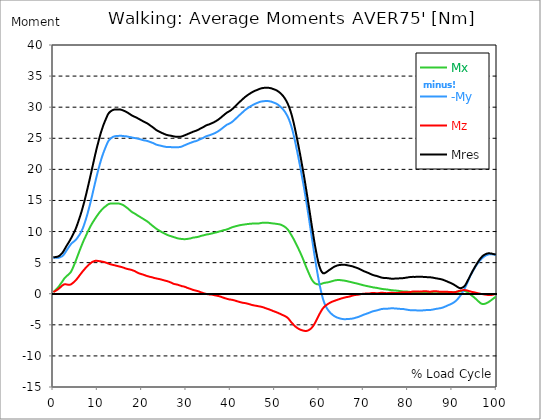
| Category |  Mx |  -My |  Mz |  Mres |
|---|---|---|---|---|
| 0.0 | 0.27 | 5.781 | 0.278 | 5.865 |
| 0.16678370786516855 | 0.362 | 5.781 | 0.337 | 5.882 |
| 0.3335674157303371 | 0.472 | 5.781 | 0.396 | 5.882 |
| 0.5003511235955057 | 0.59 | 5.764 | 0.464 | 5.891 |
| 0.6671348314606742 | 0.716 | 5.764 | 0.539 | 5.908 |
| 0.8339185393258427 | 0.834 | 5.764 | 0.607 | 5.924 |
| 1.0007022471910114 | 0.961 | 5.781 | 0.691 | 5.975 |
| 1.1674859550561796 | 1.104 | 5.79 | 0.784 | 6.017 |
| 1.3342696629213484 | 1.256 | 5.815 | 0.876 | 6.085 |
| 1.5010533707865168 | 1.433 | 5.857 | 0.986 | 6.186 |
| 1.6678370786516854 | 1.61 | 5.916 | 1.096 | 6.304 |
| 1.8346207865168538 | 1.77 | 5.967 | 1.205 | 6.413 |
| 2.001404494382023 | 1.938 | 6.034 | 1.306 | 6.54 |
| 2.1681882022471908 | 2.124 | 6.135 | 1.399 | 6.7 |
| 2.334971910112359 | 2.318 | 6.27 | 1.475 | 6.894 |
| 2.501755617977528 | 2.486 | 6.422 | 1.525 | 7.104 |
| 2.668539325842697 | 2.612 | 6.599 | 1.534 | 7.306 |
| 2.8353230337078656 | 2.73 | 6.792 | 1.517 | 7.526 |
| 3.0021067415730336 | 2.848 | 6.986 | 1.492 | 7.728 |
| 3.168890449438202 | 2.941 | 7.163 | 1.458 | 7.922 |
| 3.335674157303371 | 3.042 | 7.332 | 1.441 | 8.107 |
| 3.502457865168539 | 3.143 | 7.517 | 1.433 | 8.301 |
| 3.6692415730337076 | 3.261 | 7.694 | 1.441 | 8.503 |
| 3.8360252808988764 | 3.396 | 7.854 | 1.466 | 8.714 |
| 4.002808988764046 | 3.573 | 8.006 | 1.517 | 8.933 |
| 4.169592696629214 | 3.784 | 8.132 | 1.584 | 9.152 |
| 4.3363764044943816 | 4.045 | 8.233 | 1.685 | 9.38 |
| 4.50316011235955 | 4.323 | 8.326 | 1.778 | 9.616 |
| 4.669943820224718 | 4.618 | 8.419 | 1.896 | 9.86 |
| 4.836727528089888 | 4.905 | 8.52 | 2.014 | 10.104 |
| 5.003511235955056 | 5.208 | 8.621 | 2.132 | 10.374 |
| 5.170294943820225 | 5.511 | 8.756 | 2.259 | 10.677 |
| 5.337078651685394 | 5.823 | 8.908 | 2.393 | 10.998 |
| 5.5038623595505625 | 6.144 | 9.076 | 2.545 | 11.343 |
| 5.670646067415731 | 6.455 | 9.245 | 2.705 | 11.689 |
| 5.837429775280899 | 6.776 | 9.413 | 2.865 | 12.043 |
| 6.004213483146067 | 7.087 | 9.599 | 3.025 | 12.397 |
| 6.170997191011236 | 7.382 | 9.801 | 3.186 | 12.767 |
| 6.329002808988764 | 7.677 | 10.045 | 3.337 | 13.155 |
| 6.495786516853932 | 7.972 | 10.298 | 3.489 | 13.568 |
| 6.662570224719101 | 8.267 | 10.568 | 3.641 | 13.989 |
| 6.82935393258427 | 8.545 | 10.88 | 3.775 | 14.419 |
| 6.9961376404494375 | 8.798 | 11.225 | 3.919 | 14.874 |
| 7.162921348314607 | 9.051 | 11.604 | 4.054 | 15.346 |
| 7.329705056179775 | 9.312 | 11.975 | 4.188 | 15.818 |
| 7.496488764044945 | 9.573 | 12.363 | 4.323 | 16.307 |
| 7.663272471910113 | 9.826 | 12.776 | 4.441 | 16.804 |
| 7.830056179775281 | 10.071 | 13.214 | 4.559 | 17.318 |
| 7.996839887640449 | 10.315 | 13.652 | 4.669 | 17.824 |
| 8.16362359550562 | 10.551 | 14.099 | 4.77 | 18.338 |
| 8.330407303370787 | 10.787 | 14.562 | 4.871 | 18.86 |
| 8.497191011235955 | 11.006 | 15.06 | 4.972 | 19.391 |
| 8.663974719101123 | 11.217 | 15.557 | 5.056 | 19.922 |
| 8.830758426966291 | 11.419 | 16.054 | 5.124 | 20.445 |
| 8.99754213483146 | 11.604 | 16.577 | 5.183 | 20.984 |
| 9.16432584269663 | 11.79 | 17.091 | 5.233 | 21.515 |
| 9.331109550561798 | 11.984 | 17.605 | 5.275 | 22.046 |
| 9.497893258426966 | 12.169 | 18.102 | 5.301 | 22.56 |
| 9.664676966292134 | 12.346 | 18.599 | 5.309 | 23.057 |
| 9.831460674157304 | 12.515 | 19.079 | 5.301 | 23.537 |
| 9.998244382022472 | 12.675 | 19.543 | 5.275 | 24.001 |
| 10.16502808988764 | 12.843 | 20.006 | 5.259 | 24.464 |
| 10.331811797752808 | 13.003 | 20.445 | 5.242 | 24.911 |
| 10.498595505617978 | 13.163 | 20.883 | 5.233 | 25.349 |
| 10.665379213483147 | 13.298 | 21.296 | 5.208 | 25.762 |
| 10.832162921348315 | 13.433 | 21.7 | 5.191 | 26.158 |
| 10.998946629213483 | 13.56 | 22.071 | 5.166 | 26.521 |
| 11.165730337078653 | 13.686 | 22.417 | 5.141 | 26.875 |
| 11.33251404494382 | 13.804 | 22.745 | 5.115 | 27.203 |
| 11.49929775280899 | 13.905 | 23.066 | 5.082 | 27.507 |
| 11.666081460674157 | 13.989 | 23.361 | 5.048 | 27.793 |
| 11.832865168539326 | 14.082 | 23.655 | 5.014 | 28.071 |
| 11.999648876404493 | 14.175 | 23.942 | 4.964 | 28.349 |
| 12.166432584269662 | 14.284 | 24.22 | 4.922 | 28.628 |
| 12.333216292134832 | 14.369 | 24.456 | 4.871 | 28.864 |
| 12.5 | 14.428 | 24.65 | 4.829 | 29.049 |
| 12.66678370786517 | 14.47 | 24.785 | 4.787 | 29.175 |
| 12.833567415730336 | 14.495 | 24.903 | 4.745 | 29.285 |
| 13.000351123595506 | 14.512 | 25.004 | 4.711 | 29.369 |
| 13.167134831460674 | 14.52 | 25.097 | 4.686 | 29.453 |
| 13.333918539325843 | 14.529 | 25.172 | 4.66 | 29.512 |
| 13.500702247191011 | 14.529 | 25.24 | 4.635 | 29.571 |
| 13.667485955056181 | 14.529 | 25.29 | 4.601 | 29.605 |
| 13.834269662921349 | 14.529 | 25.324 | 4.576 | 29.63 |
| 14.001053370786519 | 14.52 | 25.341 | 4.542 | 29.639 |
| 14.167837078651687 | 14.512 | 25.358 | 4.509 | 29.639 |
| 14.334620786516853 | 14.503 | 25.366 | 4.475 | 29.639 |
| 14.501404494382026 | 14.503 | 25.366 | 4.441 | 29.639 |
| 14.668188202247192 | 14.503 | 25.383 | 4.416 | 29.647 |
| 14.834971910112362 | 14.495 | 25.391 | 4.391 | 29.647 |
| 15.001755617977528 | 14.47 | 25.4 | 4.365 | 29.639 |
| 15.168539325842698 | 14.428 | 25.4 | 4.332 | 29.614 |
| 15.335323033707864 | 14.385 | 25.391 | 4.298 | 29.588 |
| 15.502106741573034 | 14.335 | 25.383 | 4.264 | 29.546 |
| 15.6688904494382 | 14.284 | 25.366 | 4.231 | 29.504 |
| 15.83567415730337 | 14.217 | 25.349 | 4.197 | 29.445 |
| 16.00245786516854 | 14.141 | 25.341 | 4.146 | 29.394 |
| 16.16924157303371 | 14.057 | 25.333 | 4.104 | 29.344 |
| 16.336025280898877 | 13.972 | 25.324 | 4.054 | 29.285 |
| 16.502808988764045 | 13.88 | 25.307 | 4.02 | 29.226 |
| 16.669592696629216 | 13.796 | 25.282 | 3.986 | 29.159 |
| 16.83637640449438 | 13.703 | 25.257 | 3.961 | 29.083 |
| 17.003160112359552 | 13.593 | 25.231 | 3.936 | 29.007 |
| 17.169943820224717 | 13.484 | 25.206 | 3.919 | 28.923 |
| 17.336727528089888 | 13.374 | 25.189 | 3.885 | 28.847 |
| 17.503511235955056 | 13.273 | 25.172 | 3.86 | 28.771 |
| 17.670294943820224 | 13.172 | 25.139 | 3.818 | 28.695 |
| 17.837078651685395 | 13.088 | 25.105 | 3.775 | 28.619 |
| 18.003862359550563 | 13.02 | 25.08 | 3.733 | 28.56 |
| 18.17064606741573 | 12.961 | 25.054 | 3.691 | 28.51 |
| 18.3374297752809 | 12.902 | 25.038 | 3.641 | 28.459 |
| 18.504213483146067 | 12.835 | 25.021 | 3.582 | 28.408 |
| 18.662219101123597 | 12.759 | 25.004 | 3.514 | 28.349 |
| 18.829002808988765 | 12.675 | 24.979 | 3.447 | 28.29 |
| 18.995786516853933 | 12.59 | 24.953 | 3.379 | 28.215 |
| 19.1625702247191 | 12.515 | 24.92 | 3.329 | 28.156 |
| 19.32935393258427 | 12.447 | 24.894 | 3.278 | 28.088 |
| 19.49613764044944 | 12.38 | 24.861 | 3.245 | 28.029 |
| 19.662921348314608 | 12.304 | 24.835 | 3.202 | 27.97 |
| 19.829705056179776 | 12.228 | 24.793 | 3.16 | 27.894 |
| 19.996488764044944 | 12.161 | 24.759 | 3.127 | 27.827 |
| 20.163272471910112 | 12.085 | 24.717 | 3.093 | 27.76 |
| 20.33005617977528 | 12.009 | 24.692 | 3.051 | 27.692 |
| 20.49683988764045 | 11.933 | 24.667 | 3.009 | 27.633 |
| 20.663623595505616 | 11.866 | 24.641 | 2.966 | 27.583 |
| 20.830407303370787 | 11.79 | 24.625 | 2.916 | 27.524 |
| 20.997191011235955 | 11.722 | 24.599 | 2.874 | 27.473 |
| 21.163974719101123 | 11.638 | 24.574 | 2.84 | 27.406 |
| 21.330758426966295 | 11.545 | 24.532 | 2.806 | 27.33 |
| 21.497542134831463 | 11.453 | 24.49 | 2.773 | 27.246 |
| 21.66432584269663 | 11.352 | 24.448 | 2.739 | 27.161 |
| 21.8311095505618 | 11.242 | 24.406 | 2.714 | 27.069 |
| 21.997893258426966 | 11.141 | 24.355 | 2.688 | 26.984 |
| 22.164676966292134 | 11.04 | 24.313 | 2.663 | 26.9 |
| 22.331460674157306 | 10.947 | 24.279 | 2.629 | 26.816 |
| 22.498244382022467 | 10.854 | 24.229 | 2.587 | 26.731 |
| 22.66502808988764 | 10.762 | 24.178 | 2.553 | 26.639 |
| 22.831811797752806 | 10.669 | 24.119 | 2.528 | 26.546 |
| 22.99859550561798 | 10.576 | 24.06 | 2.494 | 26.445 |
| 23.165379213483146 | 10.484 | 23.993 | 2.469 | 26.352 |
| 23.332162921348313 | 10.399 | 23.95 | 2.444 | 26.268 |
| 23.49894662921348 | 10.315 | 23.917 | 2.419 | 26.201 |
| 23.665730337078653 | 10.248 | 23.891 | 2.393 | 26.15 |
| 23.83251404494382 | 10.18 | 23.866 | 2.368 | 26.091 |
| 23.999297752808985 | 10.104 | 23.841 | 2.343 | 26.032 |
| 24.166081460674157 | 10.029 | 23.816 | 2.318 | 25.973 |
| 24.332865168539325 | 9.961 | 23.782 | 2.284 | 25.914 |
| 24.499648876404496 | 9.894 | 23.757 | 2.25 | 25.855 |
| 24.666432584269664 | 9.826 | 23.723 | 2.216 | 25.804 |
| 24.833216292134832 | 9.767 | 23.698 | 2.183 | 25.754 |
| 25.0 | 9.708 | 23.672 | 2.149 | 25.703 |
| 25.16678370786517 | 9.641 | 23.647 | 2.115 | 25.644 |
| 25.33356741573034 | 9.582 | 23.613 | 2.09 | 25.594 |
| 25.500351123595504 | 9.531 | 23.596 | 2.056 | 25.56 |
| 25.66713483146067 | 9.472 | 23.588 | 2.023 | 25.518 |
| 25.833918539325843 | 9.422 | 23.58 | 1.989 | 25.493 |
| 26.00070224719101 | 9.371 | 23.58 | 1.947 | 25.467 |
| 26.16748595505618 | 9.329 | 23.58 | 1.905 | 25.442 |
| 26.334269662921347 | 9.295 | 23.58 | 1.854 | 25.425 |
| 26.50105337078652 | 9.262 | 23.58 | 1.803 | 25.417 |
| 26.667837078651687 | 9.219 | 23.58 | 1.753 | 25.391 |
| 26.834620786516858 | 9.177 | 23.563 | 1.685 | 25.358 |
| 27.001404494382022 | 9.135 | 23.546 | 1.626 | 25.324 |
| 27.16818820224719 | 9.11 | 23.537 | 1.584 | 25.299 |
| 27.334971910112362 | 9.068 | 23.537 | 1.551 | 25.282 |
| 27.50175561797753 | 9.034 | 23.537 | 1.525 | 25.265 |
| 27.668539325842698 | 8.992 | 23.537 | 1.508 | 25.257 |
| 27.835323033707866 | 8.95 | 23.546 | 1.492 | 25.248 |
| 28.002106741573037 | 8.916 | 23.554 | 1.458 | 25.24 |
| 28.168890449438205 | 8.891 | 23.563 | 1.424 | 25.24 |
| 28.335674157303373 | 8.866 | 23.563 | 1.382 | 25.231 |
| 28.502457865168537 | 8.849 | 23.588 | 1.34 | 25.24 |
| 28.669241573033705 | 8.832 | 23.613 | 1.298 | 25.248 |
| 28.836025280898877 | 8.815 | 23.639 | 1.247 | 25.274 |
| 29.002808988764052 | 8.798 | 23.681 | 1.214 | 25.299 |
| 29.169592696629213 | 8.79 | 23.731 | 1.197 | 25.349 |
| 29.336376404494384 | 8.781 | 23.79 | 1.18 | 25.4 |
| 29.50316011235955 | 8.773 | 23.841 | 1.155 | 25.442 |
| 29.669943820224724 | 8.764 | 23.891 | 1.112 | 25.484 |
| 29.836727528089884 | 8.781 | 23.942 | 1.062 | 25.535 |
| 30.003511235955056 | 8.79 | 23.993 | 1.011 | 25.585 |
| 30.170294943820224 | 8.807 | 24.043 | 0.961 | 25.636 |
| 30.337078651685395 | 8.823 | 24.094 | 0.91 | 25.686 |
| 30.503862359550563 | 8.849 | 24.144 | 0.876 | 25.745 |
| 30.670646067415728 | 8.857 | 24.195 | 0.843 | 25.796 |
| 30.837429775280903 | 8.874 | 24.237 | 0.801 | 25.838 |
| 30.99543539325843 | 8.908 | 24.279 | 0.758 | 25.889 |
| 31.162219101123597 | 8.95 | 24.321 | 0.708 | 25.939 |
| 31.32900280898876 | 8.984 | 24.363 | 0.657 | 25.998 |
| 31.495786516853936 | 9.017 | 24.414 | 0.615 | 26.049 |
| 31.6625702247191 | 9.034 | 24.456 | 0.581 | 26.091 |
| 31.82935393258427 | 9.051 | 24.49 | 0.548 | 26.133 |
| 31.996137640449433 | 9.068 | 24.515 | 0.522 | 26.167 |
| 32.162921348314605 | 9.085 | 24.549 | 0.497 | 26.209 |
| 32.329705056179776 | 9.101 | 24.591 | 0.472 | 26.251 |
| 32.49648876404494 | 9.127 | 24.641 | 0.438 | 26.302 |
| 32.66327247191011 | 9.144 | 24.692 | 0.405 | 26.361 |
| 32.83005617977528 | 9.177 | 24.751 | 0.354 | 26.428 |
| 32.996839887640455 | 9.228 | 24.81 | 0.312 | 26.495 |
| 33.16362359550562 | 9.27 | 24.861 | 0.261 | 26.563 |
| 33.330407303370784 | 9.304 | 24.911 | 0.219 | 26.622 |
| 33.497191011235955 | 9.337 | 24.962 | 0.177 | 26.681 |
| 33.66397471910113 | 9.354 | 25.012 | 0.143 | 26.731 |
| 33.83075842696629 | 9.38 | 25.071 | 0.101 | 26.79 |
| 33.997542134831455 | 9.422 | 25.147 | 0.059 | 26.875 |
| 34.164325842696634 | 9.455 | 25.215 | 0.034 | 26.951 |
| 34.3311095505618 | 9.481 | 25.274 | 0 | 27.018 |
| 34.49789325842697 | 9.514 | 25.333 | -0.034 | 27.085 |
| 34.66467696629213 | 9.531 | 25.366 | -0.059 | 27.128 |
| 34.831460674157306 | 9.557 | 25.408 | -0.084 | 27.17 |
| 34.99824438202247 | 9.573 | 25.434 | -0.101 | 27.203 |
| 35.16502808988764 | 9.59 | 25.467 | -0.11 | 27.237 |
| 35.331811797752806 | 9.624 | 25.509 | -0.11 | 27.296 |
| 35.49859550561798 | 9.649 | 25.56 | -0.118 | 27.347 |
| 35.66537921348315 | 9.675 | 25.602 | -0.135 | 27.397 |
| 35.83216292134831 | 9.7 | 25.644 | -0.152 | 27.448 |
| 35.998946629213485 | 9.725 | 25.695 | -0.177 | 27.498 |
| 36.16573033707865 | 9.767 | 25.745 | -0.202 | 27.557 |
| 36.33251404494382 | 9.801 | 25.796 | -0.236 | 27.616 |
| 36.499297752808985 | 9.826 | 25.847 | -0.261 | 27.684 |
| 36.666081460674164 | 9.852 | 25.914 | -0.278 | 27.751 |
| 36.83286516853932 | 9.877 | 25.981 | -0.303 | 27.827 |
| 36.99964887640449 | 9.911 | 26.04 | -0.337 | 27.894 |
| 37.166432584269664 | 9.953 | 26.116 | -0.362 | 27.979 |
| 37.333216292134836 | 9.986 | 26.201 | -0.388 | 28.071 |
| 37.5 | 10.02 | 26.285 | -0.421 | 28.164 |
| 37.666783707865164 | 10.054 | 26.377 | -0.455 | 28.265 |
| 37.833567415730336 | 10.087 | 26.453 | -0.497 | 28.349 |
| 38.00035112359551 | 10.121 | 26.546 | -0.539 | 28.451 |
| 38.16713483146068 | 10.163 | 26.647 | -0.59 | 28.56 |
| 38.333918539325836 | 10.197 | 26.74 | -0.632 | 28.661 |
| 38.50070224719101 | 10.231 | 26.833 | -0.666 | 28.754 |
| 38.66748595505618 | 10.248 | 26.925 | -0.708 | 28.855 |
| 38.83426966292135 | 10.273 | 27.018 | -0.742 | 28.956 |
| 39.001053370786515 | 10.307 | 27.111 | -0.784 | 29.049 |
| 39.16783707865169 | 10.349 | 27.187 | -0.817 | 29.133 |
| 39.33462078651686 | 10.391 | 27.254 | -0.851 | 29.209 |
| 39.50140449438202 | 10.433 | 27.296 | -0.885 | 29.268 |
| 39.668188202247194 | 10.484 | 27.347 | -0.91 | 29.335 |
| 39.83497191011236 | 10.543 | 27.406 | -0.927 | 29.403 |
| 40.00175561797753 | 10.602 | 27.473 | -0.944 | 29.487 |
| 40.168539325842694 | 10.644 | 27.549 | -0.961 | 29.58 |
| 40.335323033707866 | 10.686 | 27.633 | -0.978 | 29.673 |
| 40.50210674157304 | 10.728 | 27.734 | -1.003 | 29.782 |
| 40.6688904494382 | 10.762 | 27.835 | -1.037 | 29.892 |
| 40.83567415730337 | 10.795 | 27.945 | -1.07 | 30.01 |
| 41.00245786516854 | 10.829 | 28.055 | -1.104 | 30.128 |
| 41.16924157303371 | 10.863 | 28.173 | -1.138 | 30.246 |
| 41.33602528089887 | 10.888 | 28.29 | -1.18 | 30.364 |
| 41.502808988764045 | 10.922 | 28.4 | -1.214 | 30.482 |
| 41.669592696629216 | 10.947 | 28.51 | -1.256 | 30.6 |
| 41.83637640449439 | 10.981 | 28.628 | -1.289 | 30.718 |
| 42.00316011235955 | 11.006 | 28.737 | -1.323 | 30.827 |
| 42.16994382022472 | 11.031 | 28.838 | -1.357 | 30.937 |
| 42.33672752808989 | 11.057 | 28.948 | -1.391 | 31.046 |
| 42.50351123595506 | 11.073 | 29.057 | -1.424 | 31.156 |
| 42.670294943820224 | 11.09 | 29.159 | -1.449 | 31.265 |
| 42.83707865168539 | 11.107 | 29.268 | -1.466 | 31.375 |
| 43.00386235955057 | 11.124 | 29.378 | -1.483 | 31.476 |
| 43.17064606741573 | 11.141 | 29.487 | -1.5 | 31.586 |
| 43.32865168539326 | 11.158 | 29.58 | -1.517 | 31.678 |
| 43.495435393258425 | 11.175 | 29.673 | -1.542 | 31.771 |
| 43.6622191011236 | 11.191 | 29.757 | -1.576 | 31.864 |
| 43.82900280898876 | 11.208 | 29.841 | -1.601 | 31.948 |
| 43.99578651685393 | 11.217 | 29.925 | -1.635 | 32.032 |
| 44.162570224719104 | 11.234 | 30.001 | -1.669 | 32.108 |
| 44.32935393258427 | 11.242 | 30.077 | -1.702 | 32.184 |
| 44.49613764044944 | 11.259 | 30.153 | -1.744 | 32.26 |
| 44.66292134831461 | 11.267 | 30.22 | -1.778 | 32.336 |
| 44.82970505617978 | 11.276 | 30.288 | -1.803 | 32.403 |
| 44.99648876404493 | 11.284 | 30.355 | -1.837 | 32.462 |
| 45.16327247191011 | 11.293 | 30.414 | -1.862 | 32.529 |
| 45.33005617977528 | 11.301 | 30.473 | -1.888 | 32.588 |
| 45.49683988764045 | 11.301 | 30.532 | -1.905 | 32.639 |
| 45.66362359550561 | 11.293 | 30.591 | -1.93 | 32.69 |
| 45.83040730337079 | 11.293 | 30.642 | -1.947 | 32.74 |
| 45.99719101123596 | 11.284 | 30.692 | -1.972 | 32.791 |
| 46.16397471910113 | 11.284 | 30.734 | -1.997 | 32.833 |
| 46.33075842696629 | 11.293 | 30.785 | -2.023 | 32.875 |
| 46.497542134831455 | 11.318 | 30.836 | -2.031 | 32.934 |
| 46.66432584269663 | 11.36 | 30.869 | -2.056 | 32.985 |
| 46.83110955056179 | 11.385 | 30.895 | -2.082 | 33.018 |
| 46.99789325842696 | 11.394 | 30.92 | -2.115 | 33.043 |
| 47.164676966292134 | 11.402 | 30.937 | -2.149 | 33.069 |
| 47.331460674157306 | 11.402 | 30.954 | -2.183 | 33.086 |
| 47.49824438202247 | 11.411 | 30.97 | -2.225 | 33.102 |
| 47.66502808988764 | 11.411 | 30.979 | -2.267 | 33.119 |
| 47.83181179775281 | 11.419 | 30.979 | -2.309 | 33.128 |
| 47.99859550561797 | 11.419 | 30.979 | -2.36 | 33.128 |
| 48.16537921348314 | 11.411 | 30.979 | -2.402 | 33.119 |
| 48.33216292134831 | 11.411 | 30.979 | -2.435 | 33.128 |
| 48.498946629213485 | 11.402 | 30.979 | -2.469 | 33.119 |
| 48.66573033707865 | 11.394 | 30.962 | -2.52 | 33.111 |
| 48.83251404494382 | 11.377 | 30.937 | -2.562 | 33.086 |
| 48.99929775280899 | 11.352 | 30.92 | -2.604 | 33.06 |
| 49.166081460674164 | 11.335 | 30.895 | -2.646 | 33.035 |
| 49.33286516853933 | 11.318 | 30.844 | -2.705 | 32.985 |
| 49.499648876404486 | 11.309 | 30.793 | -2.756 | 32.942 |
| 49.666432584269664 | 11.293 | 30.751 | -2.806 | 32.892 |
| 49.83321629213483 | 11.284 | 30.709 | -2.848 | 32.858 |
| 50.0 | 11.267 | 30.667 | -2.891 | 32.824 |
| 50.166783707865164 | 11.25 | 30.616 | -2.933 | 32.774 |
| 50.33356741573034 | 11.234 | 30.557 | -2.983 | 32.706 |
| 50.50035112359551 | 11.217 | 30.49 | -3.025 | 32.647 |
| 50.66713483146068 | 11.2 | 30.406 | -3.076 | 32.572 |
| 50.83391853932584 | 11.183 | 30.313 | -3.135 | 32.479 |
| 51.00070224719101 | 11.158 | 30.22 | -3.186 | 32.386 |
| 51.16748595505618 | 11.132 | 30.111 | -3.245 | 32.285 |
| 51.33426966292134 | 11.09 | 29.993 | -3.295 | 32.167 |
| 51.50105337078652 | 11.048 | 29.883 | -3.354 | 32.049 |
| 51.66783707865169 | 10.989 | 29.765 | -3.405 | 31.931 |
| 51.83462078651686 | 10.93 | 29.639 | -3.464 | 31.796 |
| 52.00140449438202 | 10.854 | 29.496 | -3.514 | 31.645 |
| 52.168188202247194 | 10.779 | 29.327 | -3.573 | 31.468 |
| 52.33497191011236 | 10.694 | 29.15 | -3.624 | 31.282 |
| 52.50175561797752 | 10.602 | 28.956 | -3.691 | 31.072 |
| 52.668539325842694 | 10.5 | 28.746 | -3.775 | 30.852 |
| 52.835323033707866 | 10.374 | 28.526 | -3.86 | 30.616 |
| 53.00210674157304 | 10.222 | 28.274 | -3.969 | 30.347 |
| 53.1688904494382 | 10.045 | 27.987 | -4.113 | 30.043 |
| 53.33567415730337 | 9.852 | 27.675 | -4.273 | 29.715 |
| 53.502457865168545 | 9.649 | 27.338 | -4.433 | 29.361 |
| 53.669241573033716 | 9.455 | 26.967 | -4.584 | 28.982 |
| 53.83602528089887 | 9.253 | 26.571 | -4.719 | 28.569 |
| 54.002808988764045 | 9.051 | 26.125 | -4.846 | 28.114 |
| 54.169592696629216 | 8.84 | 25.636 | -4.972 | 27.625 |
| 54.33637640449438 | 8.621 | 25.13 | -5.099 | 27.111 |
| 54.50316011235955 | 8.385 | 24.608 | -5.208 | 26.571 |
| 54.669943820224724 | 8.149 | 24.043 | -5.318 | 26.015 |
| 54.836727528089895 | 7.905 | 23.47 | -5.41 | 25.434 |
| 55.00351123595506 | 7.66 | 22.889 | -5.495 | 24.844 |
| 55.17029494382022 | 7.416 | 22.299 | -5.57 | 24.245 |
| 55.337078651685395 | 7.172 | 21.7 | -5.646 | 23.639 |
| 55.50386235955056 | 6.919 | 21.094 | -5.705 | 23.023 |
| 55.66186797752809 | 6.666 | 20.487 | -5.764 | 22.408 |
| 55.82865168539326 | 6.396 | 19.846 | -5.806 | 21.759 |
| 55.995435393258425 | 6.127 | 19.189 | -5.849 | 21.094 |
| 56.1622191011236 | 5.849 | 18.532 | -5.891 | 20.428 |
| 56.32900280898877 | 5.57 | 17.891 | -5.924 | 19.77 |
| 56.49578651685393 | 5.267 | 17.225 | -5.95 | 19.088 |
| 56.6625702247191 | 4.964 | 16.534 | -5.975 | 18.388 |
| 56.82935393258427 | 4.66 | 15.818 | -5.983 | 17.664 |
| 56.99613764044943 | 4.357 | 15.085 | -5.992 | 16.93 |
| 57.16292134831461 | 4.07 | 14.335 | -5.967 | 16.172 |
| 57.329705056179776 | 3.792 | 13.585 | -5.941 | 15.422 |
| 57.49648876404495 | 3.514 | 12.835 | -5.891 | 14.664 |
| 57.66327247191011 | 3.236 | 12.068 | -5.832 | 13.905 |
| 57.83005617977529 | 2.966 | 11.293 | -5.764 | 13.13 |
| 57.99683988764044 | 2.705 | 10.5 | -5.672 | 12.346 |
| 58.16362359550561 | 2.461 | 9.717 | -5.57 | 11.562 |
| 58.33040730337079 | 2.242 | 8.925 | -5.444 | 10.795 |
| 58.497191011235955 | 2.065 | 8.141 | -5.292 | 10.037 |
| 58.66397471910112 | 1.905 | 7.349 | -5.124 | 9.287 |
| 58.83075842696629 | 1.778 | 6.565 | -4.93 | 8.545 |
| 58.99754213483147 | 1.677 | 5.79 | -4.728 | 7.846 |
| 59.164325842696634 | 1.61 | 5.056 | -4.5 | 7.197 |
| 59.33110955056179 | 1.559 | 4.332 | -4.264 | 6.573 |
| 59.49789325842697 | 1.525 | 3.624 | -4.02 | 5.958 |
| 59.664676966292134 | 1.492 | 2.933 | -3.775 | 5.377 |
| 59.8314606741573 | 1.492 | 2.275 | -3.548 | 4.871 |
| 59.99824438202247 | 1.5 | 1.66 | -3.32 | 4.458 |
| 60.16502808988765 | 1.525 | 1.096 | -3.101 | 4.104 |
| 60.33181179775281 | 1.559 | 0.548 | -2.891 | 3.801 |
| 60.49859550561798 | 1.593 | 0.034 | -2.68 | 3.556 |
| 60.66537921348315 | 1.635 | -0.43 | -2.494 | 3.396 |
| 60.83216292134831 | 1.685 | -0.86 | -2.326 | 3.304 |
| 60.99894662921348 | 1.728 | -1.23 | -2.183 | 3.27 |
| 61.16573033707864 | 1.753 | -1.551 | -2.065 | 3.295 |
| 61.33251404494383 | 1.77 | -1.829 | -1.955 | 3.354 |
| 61.49929775280899 | 1.787 | -2.073 | -1.862 | 3.43 |
| 61.66608146067416 | 1.795 | -2.292 | -1.778 | 3.506 |
| 61.83286516853932 | 1.82 | -2.478 | -1.702 | 3.598 |
| 61.99964887640451 | 1.846 | -2.646 | -1.626 | 3.683 |
| 62.16643258426967 | 1.871 | -2.806 | -1.551 | 3.775 |
| 62.33321629213482 | 1.905 | -2.95 | -1.483 | 3.851 |
| 62.5 | 1.938 | -3.076 | -1.416 | 3.936 |
| 62.66678370786517 | 1.972 | -3.194 | -1.357 | 4.02 |
| 62.833567415730336 | 2.006 | -3.295 | -1.306 | 4.096 |
| 63.0003511235955 | 2.048 | -3.405 | -1.247 | 4.18 |
| 63.16713483146068 | 2.082 | -3.489 | -1.205 | 4.256 |
| 63.33391853932585 | 2.115 | -3.573 | -1.163 | 4.323 |
| 63.500702247191015 | 2.141 | -3.641 | -1.121 | 4.382 |
| 63.66748595505618 | 2.166 | -3.708 | -1.079 | 4.441 |
| 63.83426966292135 | 2.183 | -3.767 | -1.037 | 4.483 |
| 64.00105337078651 | 2.191 | -3.826 | -0.994 | 4.534 |
| 64.16783707865169 | 2.2 | -3.868 | -0.952 | 4.568 |
| 64.33462078651687 | 2.2 | -3.902 | -0.91 | 4.593 |
| 64.50140449438203 | 2.2 | -3.944 | -0.868 | 4.61 |
| 64.6681882022472 | 2.191 | -3.978 | -0.826 | 4.627 |
| 64.83497191011236 | 2.183 | -4.003 | -0.792 | 4.643 |
| 65.00175561797754 | 2.166 | -4.037 | -0.758 | 4.66 |
| 65.16853932584269 | 2.149 | -4.062 | -0.725 | 4.66 |
| 65.33532303370787 | 2.132 | -4.079 | -0.691 | 4.66 |
| 65.50210674157304 | 2.124 | -4.087 | -0.657 | 4.669 |
| 65.66889044943821 | 2.107 | -4.096 | -0.624 | 4.652 |
| 65.83567415730337 | 2.082 | -4.096 | -0.59 | 4.643 |
| 66.00245786516854 | 2.065 | -4.087 | -0.556 | 4.618 |
| 66.1692415730337 | 2.031 | -4.079 | -0.539 | 4.601 |
| 66.33602528089888 | 2.006 | -4.07 | -0.514 | 4.576 |
| 66.50280898876404 | 1.98 | -4.054 | -0.497 | 4.551 |
| 66.66959269662921 | 1.955 | -4.054 | -0.472 | 4.525 |
| 66.83637640449439 | 1.921 | -4.045 | -0.447 | 4.509 |
| 67.00316011235955 | 1.888 | -4.037 | -0.413 | 4.483 |
| 67.16994382022472 | 1.862 | -4.028 | -0.371 | 4.458 |
| 67.33672752808988 | 1.829 | -4.011 | -0.337 | 4.433 |
| 67.50351123595506 | 1.803 | -3.995 | -0.295 | 4.399 |
| 67.67029494382022 | 1.778 | -3.969 | -0.261 | 4.357 |
| 67.83707865168539 | 1.753 | -3.936 | -0.236 | 4.315 |
| 67.99508426966291 | 1.728 | -3.902 | -0.211 | 4.273 |
| 68.16186797752809 | 1.694 | -3.86 | -0.194 | 4.231 |
| 68.32865168539327 | 1.669 | -3.826 | -0.185 | 4.188 |
| 68.49543539325843 | 1.643 | -3.801 | -0.177 | 4.146 |
| 68.6622191011236 | 1.61 | -3.767 | -0.169 | 4.104 |
| 68.82900280898876 | 1.576 | -3.716 | -0.143 | 4.054 |
| 68.99578651685394 | 1.542 | -3.674 | -0.118 | 3.995 |
| 69.1625702247191 | 1.508 | -3.632 | -0.093 | 3.936 |
| 69.32935393258425 | 1.475 | -3.582 | -0.067 | 3.885 |
| 69.49613764044945 | 1.449 | -3.531 | -0.042 | 3.826 |
| 69.66292134831461 | 1.416 | -3.48 | -0.025 | 3.759 |
| 69.82970505617978 | 1.382 | -3.43 | -0.008 | 3.7 |
| 69.99648876404494 | 1.357 | -3.379 | 0 | 3.641 |
| 70.16327247191012 | 1.323 | -3.337 | 0.008 | 3.59 |
| 70.33005617977528 | 1.298 | -3.295 | 0.017 | 3.548 |
| 70.49683988764045 | 1.273 | -3.253 | 0.025 | 3.497 |
| 70.66362359550561 | 1.247 | -3.211 | 0.034 | 3.447 |
| 70.83040730337079 | 1.222 | -3.169 | 0.025 | 3.405 |
| 70.99719101123596 | 1.197 | -3.127 | 0.025 | 3.354 |
| 71.16397471910112 | 1.171 | -3.084 | 0.034 | 3.304 |
| 71.3307584269663 | 1.146 | -3.034 | 0.042 | 3.253 |
| 71.49754213483146 | 1.121 | -2.992 | 0.067 | 3.194 |
| 71.66432584269663 | 1.096 | -2.941 | 0.084 | 3.143 |
| 71.83110955056179 | 1.07 | -2.891 | 0.11 | 3.084 |
| 71.99789325842697 | 1.045 | -2.848 | 0.118 | 3.034 |
| 72.16467696629215 | 1.02 | -2.806 | 0.118 | 2.992 |
| 72.3314606741573 | 1.003 | -2.781 | 0.118 | 2.958 |
| 72.49824438202248 | 0.986 | -2.747 | 0.11 | 2.924 |
| 72.66502808988764 | 0.969 | -2.73 | 0.093 | 2.899 |
| 72.8318117977528 | 0.952 | -2.705 | 0.076 | 2.874 |
| 72.99859550561797 | 0.935 | -2.68 | 0.076 | 2.84 |
| 73.16537921348315 | 0.91 | -2.646 | 0.076 | 2.806 |
| 73.33216292134833 | 0.885 | -2.612 | 0.093 | 2.764 |
| 73.49894662921349 | 0.86 | -2.57 | 0.11 | 2.722 |
| 73.66573033707864 | 0.834 | -2.537 | 0.126 | 2.68 |
| 73.83251404494382 | 0.809 | -2.503 | 0.143 | 2.638 |
| 73.99929775280899 | 0.784 | -2.469 | 0.152 | 2.604 |
| 74.16608146067415 | 0.767 | -2.452 | 0.152 | 2.579 |
| 74.33286516853933 | 0.75 | -2.435 | 0.143 | 2.553 |
| 74.49964887640449 | 0.733 | -2.427 | 0.135 | 2.545 |
| 74.66643258426967 | 0.725 | -2.427 | 0.126 | 2.537 |
| 74.83321629213484 | 0.708 | -2.419 | 0.11 | 2.528 |
| 75.0 | 0.699 | -2.427 | 0.101 | 2.528 |
| 75.16678370786516 | 0.691 | -2.419 | 0.093 | 2.52 |
| 75.33356741573033 | 0.674 | -2.41 | 0.093 | 2.511 |
| 75.5003511235955 | 0.657 | -2.402 | 0.101 | 2.494 |
| 75.66713483146067 | 0.632 | -2.385 | 0.118 | 2.478 |
| 75.83391853932585 | 0.615 | -2.377 | 0.135 | 2.461 |
| 76.00070224719101 | 0.598 | -2.36 | 0.152 | 2.444 |
| 76.16748595505618 | 0.581 | -2.343 | 0.16 | 2.427 |
| 76.33426966292136 | 0.565 | -2.334 | 0.16 | 2.41 |
| 76.50105337078652 | 0.556 | -2.334 | 0.152 | 2.41 |
| 76.66783707865167 | 0.539 | -2.343 | 0.143 | 2.41 |
| 76.83462078651685 | 0.531 | -2.351 | 0.126 | 2.419 |
| 77.00140449438202 | 0.522 | -2.368 | 0.118 | 2.435 |
| 77.1681882022472 | 0.514 | -2.377 | 0.11 | 2.444 |
| 77.33497191011236 | 0.497 | -2.385 | 0.118 | 2.444 |
| 77.50175561797754 | 0.489 | -2.393 | 0.118 | 2.452 |
| 77.6685393258427 | 0.472 | -2.402 | 0.126 | 2.461 |
| 77.83532303370787 | 0.464 | -2.41 | 0.135 | 2.461 |
| 78.00210674157303 | 0.447 | -2.427 | 0.152 | 2.478 |
| 78.1688904494382 | 0.43 | -2.435 | 0.177 | 2.478 |
| 78.33567415730337 | 0.413 | -2.444 | 0.194 | 2.486 |
| 78.50245786516854 | 0.396 | -2.444 | 0.219 | 2.494 |
| 78.66924157303372 | 0.388 | -2.452 | 0.236 | 2.494 |
| 78.83602528089888 | 0.371 | -2.461 | 0.253 | 2.503 |
| 79.00280898876404 | 0.371 | -2.469 | 0.253 | 2.52 |
| 79.16959269662921 | 0.362 | -2.486 | 0.253 | 2.537 |
| 79.33637640449439 | 0.362 | -2.511 | 0.244 | 2.553 |
| 79.50316011235955 | 0.354 | -2.528 | 0.236 | 2.57 |
| 79.66994382022472 | 0.354 | -2.553 | 0.228 | 2.596 |
| 79.8367275280899 | 0.346 | -2.57 | 0.228 | 2.612 |
| 80.00351123595506 | 0.329 | -2.596 | 0.228 | 2.629 |
| 80.17029494382022 | 0.32 | -2.612 | 0.244 | 2.646 |
| 80.32830056179776 | 0.303 | -2.629 | 0.253 | 2.671 |
| 80.49508426966293 | 0.287 | -2.646 | 0.27 | 2.688 |
| 80.66186797752809 | 0.278 | -2.663 | 0.295 | 2.697 |
| 80.82865168539325 | 0.261 | -2.671 | 0.32 | 2.705 |
| 80.99543539325842 | 0.253 | -2.671 | 0.346 | 2.714 |
| 81.1622191011236 | 0.244 | -2.671 | 0.362 | 2.714 |
| 81.32900280898878 | 0.236 | -2.671 | 0.371 | 2.705 |
| 81.49578651685394 | 0.228 | -2.671 | 0.371 | 2.705 |
| 81.6625702247191 | 0.219 | -2.671 | 0.362 | 2.714 |
| 81.82935393258427 | 0.211 | -2.68 | 0.354 | 2.714 |
| 81.99613764044945 | 0.202 | -2.68 | 0.354 | 2.714 |
| 82.16292134831461 | 0.194 | -2.688 | 0.346 | 2.722 |
| 82.32970505617978 | 0.185 | -2.697 | 0.337 | 2.73 |
| 82.49648876404494 | 0.177 | -2.697 | 0.337 | 2.73 |
| 82.66327247191012 | 0.169 | -2.697 | 0.337 | 2.73 |
| 82.83005617977528 | 0.152 | -2.705 | 0.346 | 2.73 |
| 82.99683988764045 | 0.143 | -2.697 | 0.362 | 2.73 |
| 83.16362359550563 | 0.135 | -2.688 | 0.371 | 2.722 |
| 83.33040730337079 | 0.118 | -2.68 | 0.388 | 2.722 |
| 83.49719101123596 | 0.118 | -2.671 | 0.396 | 2.705 |
| 83.66397471910112 | 0.11 | -2.655 | 0.405 | 2.697 |
| 83.8307584269663 | 0.11 | -2.646 | 0.405 | 2.688 |
| 83.99754213483146 | 0.11 | -2.638 | 0.405 | 2.671 |
| 84.16432584269663 | 0.101 | -2.629 | 0.396 | 2.671 |
| 84.33110955056179 | 0.11 | -2.629 | 0.379 | 2.663 |
| 84.49789325842697 | 0.11 | -2.629 | 0.354 | 2.663 |
| 84.66467696629213 | 0.11 | -2.629 | 0.337 | 2.663 |
| 84.8314606741573 | 0.11 | -2.621 | 0.329 | 2.655 |
| 84.99824438202248 | 0.11 | -2.612 | 0.329 | 2.646 |
| 85.16502808988764 | 0.101 | -2.604 | 0.337 | 2.629 |
| 85.3318117977528 | 0.101 | -2.587 | 0.354 | 2.621 |
| 85.49859550561797 | 0.101 | -2.562 | 0.371 | 2.596 |
| 85.66537921348315 | 0.093 | -2.537 | 0.388 | 2.57 |
| 85.83216292134831 | 0.093 | -2.511 | 0.405 | 2.553 |
| 85.99894662921348 | 0.093 | -2.486 | 0.405 | 2.528 |
| 86.16573033707866 | 0.084 | -2.461 | 0.405 | 2.503 |
| 86.33251404494384 | 0.084 | -2.435 | 0.405 | 2.486 |
| 86.499297752809 | 0.093 | -2.419 | 0.388 | 2.461 |
| 86.66608146067415 | 0.093 | -2.402 | 0.371 | 2.444 |
| 86.83286516853933 | 0.101 | -2.377 | 0.354 | 2.419 |
| 86.99964887640449 | 0.118 | -2.36 | 0.337 | 2.393 |
| 87.16643258426966 | 0.126 | -2.334 | 0.32 | 2.377 |
| 87.33321629213482 | 0.126 | -2.318 | 0.312 | 2.351 |
| 87.5 | 0.126 | -2.292 | 0.303 | 2.326 |
| 87.66678370786518 | 0.126 | -2.267 | 0.303 | 2.301 |
| 87.83356741573033 | 0.135 | -2.225 | 0.303 | 2.259 |
| 88.00035112359551 | 0.135 | -2.183 | 0.312 | 2.216 |
| 88.16713483146067 | 0.143 | -2.132 | 0.32 | 2.174 |
| 88.33391853932584 | 0.143 | -2.082 | 0.329 | 2.124 |
| 88.500702247191 | 0.152 | -2.031 | 0.329 | 2.073 |
| 88.66748595505618 | 0.16 | -1.98 | 0.329 | 2.023 |
| 88.83426966292136 | 0.169 | -1.921 | 0.32 | 1.972 |
| 89.00105337078652 | 0.177 | -1.871 | 0.303 | 1.913 |
| 89.16783707865169 | 0.194 | -1.82 | 0.287 | 1.862 |
| 89.33462078651687 | 0.202 | -1.77 | 0.27 | 1.82 |
| 89.50140449438203 | 0.211 | -1.719 | 0.261 | 1.77 |
| 89.6681882022472 | 0.219 | -1.669 | 0.261 | 1.719 |
| 89.83497191011236 | 0.219 | -1.61 | 0.261 | 1.669 |
| 90.00175561797754 | 0.228 | -1.551 | 0.261 | 1.601 |
| 90.16853932584269 | 0.236 | -1.483 | 0.253 | 1.542 |
| 90.33532303370787 | 0.253 | -1.407 | 0.244 | 1.475 |
| 90.50210674157303 | 0.261 | -1.332 | 0.244 | 1.399 |
| 90.6688904494382 | 0.278 | -1.23 | 0.261 | 1.323 |
| 90.83567415730336 | 0.295 | -1.129 | 0.287 | 1.247 |
| 91.00245786516854 | 0.303 | -1.02 | 0.312 | 1.163 |
| 91.1692415730337 | 0.312 | -0.885 | 0.354 | 1.087 |
| 91.33602528089888 | 0.329 | -0.75 | 0.405 | 1.02 |
| 91.50280898876404 | 0.337 | -0.598 | 0.447 | 0.952 |
| 91.66959269662922 | 0.362 | -0.455 | 0.472 | 0.91 |
| 91.83637640449439 | 0.379 | -0.295 | 0.497 | 0.885 |
| 92.00316011235955 | 0.405 | -0.118 | 0.522 | 0.91 |
| 92.16994382022472 | 0.421 | 0.067 | 0.548 | 0.944 |
| 92.3367275280899 | 0.447 | 0.261 | 0.565 | 1.003 |
| 92.50351123595506 | 0.455 | 0.455 | 0.581 | 1.07 |
| 92.66151685393258 | 0.455 | 0.657 | 0.59 | 1.163 |
| 92.82830056179776 | 0.438 | 0.893 | 0.59 | 1.289 |
| 92.99508426966291 | 0.405 | 1.138 | 0.573 | 1.466 |
| 93.16186797752809 | 0.354 | 1.399 | 0.548 | 1.685 |
| 93.32865168539325 | 0.287 | 1.66 | 0.514 | 1.905 |
| 93.49543539325842 | 0.202 | 1.938 | 0.489 | 2.132 |
| 93.66221910112358 | 0.11 | 2.208 | 0.447 | 2.368 |
| 93.82900280898876 | 0.025 | 2.486 | 0.413 | 2.604 |
| 93.99578651685393 | -0.067 | 2.756 | 0.371 | 2.84 |
| 94.1625702247191 | -0.16 | 3.009 | 0.337 | 3.076 |
| 94.32935393258427 | -0.253 | 3.245 | 0.312 | 3.304 |
| 94.49613764044945 | -0.354 | 3.464 | 0.287 | 3.531 |
| 94.66292134831461 | -0.447 | 3.683 | 0.261 | 3.75 |
| 94.82970505617978 | -0.539 | 3.885 | 0.236 | 3.961 |
| 94.99648876404494 | -0.64 | 4.087 | 0.211 | 4.172 |
| 95.16327247191012 | -0.742 | 4.281 | 0.185 | 4.382 |
| 95.33005617977528 | -0.851 | 4.475 | 0.16 | 4.584 |
| 95.49683988764046 | -0.961 | 4.652 | 0.126 | 4.778 |
| 95.66362359550563 | -1.07 | 4.82 | 0.101 | 4.972 |
| 95.83040730337078 | -1.188 | 4.981 | 0.067 | 5.158 |
| 95.99719101123594 | -1.298 | 5.141 | 0.042 | 5.334 |
| 96.16397471910112 | -1.399 | 5.284 | 0.017 | 5.503 |
| 96.33075842696628 | -1.492 | 5.419 | -0.017 | 5.663 |
| 96.49754213483145 | -1.584 | 5.545 | -0.034 | 5.806 |
| 96.66432584269663 | -1.643 | 5.672 | -0.059 | 5.941 |
| 96.8311095505618 | -1.66 | 5.781 | -0.067 | 6.059 |
| 96.99789325842697 | -1.66 | 5.882 | -0.093 | 6.152 |
| 97.16467696629213 | -1.643 | 5.967 | -0.11 | 6.228 |
| 97.3314606741573 | -1.626 | 6.051 | -0.126 | 6.304 |
| 97.49824438202248 | -1.584 | 6.127 | -0.143 | 6.363 |
| 97.66502808988764 | -1.525 | 6.186 | -0.169 | 6.413 |
| 97.8318117977528 | -1.475 | 6.245 | -0.177 | 6.455 |
| 97.99859550561798 | -1.407 | 6.287 | -0.194 | 6.481 |
| 98.16537921348316 | -1.348 | 6.32 | -0.211 | 6.497 |
| 98.33216292134833 | -1.273 | 6.337 | -0.219 | 6.497 |
| 98.49894662921349 | -1.18 | 6.346 | -0.219 | 6.489 |
| 98.66573033707866 | -1.096 | 6.354 | -0.211 | 6.481 |
| 98.8325140449438 | -1.011 | 6.354 | -0.202 | 6.464 |
| 98.99929775280897 | -0.919 | 6.337 | -0.177 | 6.43 |
| 99.16608146067416 | -0.826 | 6.312 | -0.152 | 6.396 |
| 99.33286516853933 | -0.733 | 6.295 | -0.118 | 6.371 |
| 99.49964887640449 | -0.649 | 6.278 | -0.084 | 6.346 |
| 99.66643258426966 | -0.556 | 6.261 | -0.059 | 6.32 |
| 99.83321629213484 | -0.472 | 6.245 | -0.034 | 6.304 |
| 100.0 | -0.405 | 6.245 | -0.008 | 6.287 |